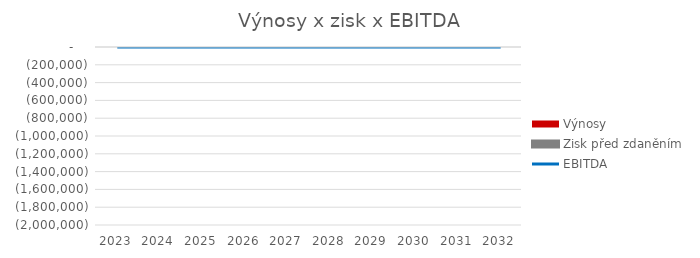
| Category | Výnosy | Zisk před zdaněním |
|---|---|---|
| 2023 | 0 | 0 |
| 2024 | 0 | 0 |
| 2025 | 0 | 0 |
| 2026 | 0 | 0 |
| 2027 | 0 | 0 |
| 2028 | 0 | 0 |
| 2029 | 0 | 0 |
| 2030 | 0 | 0 |
| 2031 | 0 | 0 |
| 2032 | 0 | 0 |